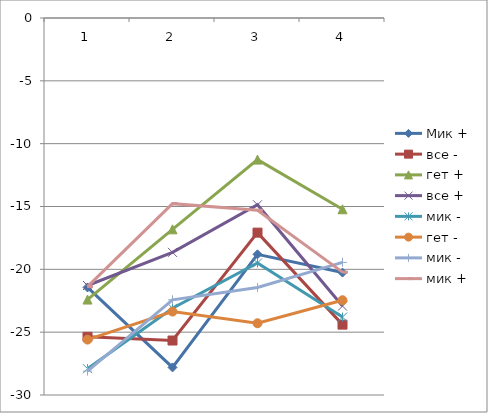
| Category | Мик + | все - | гет + | все + | мик - | гет - | мик + |
|---|---|---|---|---|---|---|---|
| 0 | -21.443 | -25.371 | -22.405 | -21.288 | -28.097 | -25.593 | -21.374 |
| 1 | -27.804 | -25.665 | -16.814 | -18.651 | -22.426 | -23.362 | -14.772 |
| 2 | -18.804 | -17.08 | -11.268 | -14.864 | -21.439 | -24.291 | -15.294 |
| 3 | -20.258 | -24.4 | -15.219 | -22.925 | -19.446 | -22.46 | -20.224 |